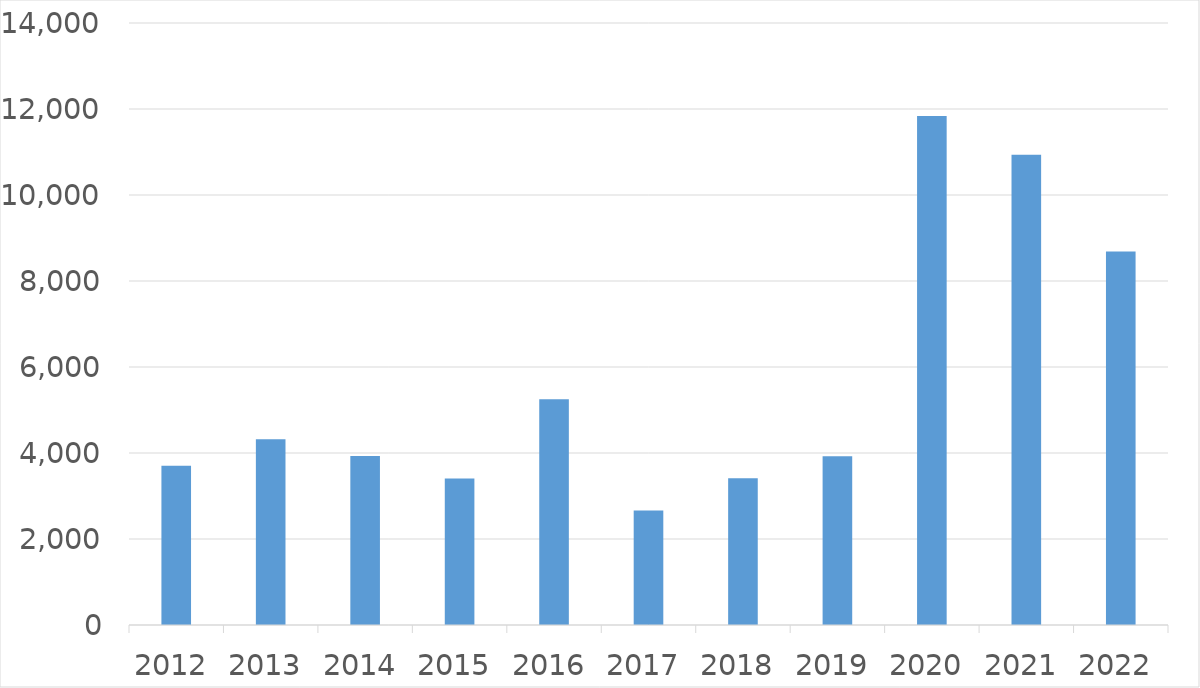
| Category | Series 0 |
|---|---|
| 2012 | 3706 |
| 2013 | 4321 |
| 2014 | 3928 |
| 2015 | 3405 |
| 2016 | 5249 |
| 2017 | 2664 |
| 2018 | 3410 |
| 2019 | 3923 |
| 2020 | 11835 |
| 2021 | 10937 |
| 2022 | 8685 |